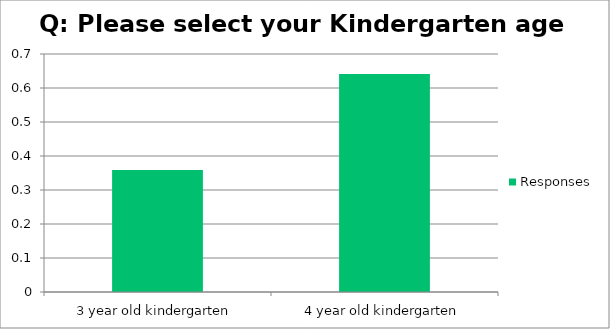
| Category | Responses |
|---|---|
| 3 year old kindergarten | 0.359 |
| 4 year old kindergarten | 0.641 |